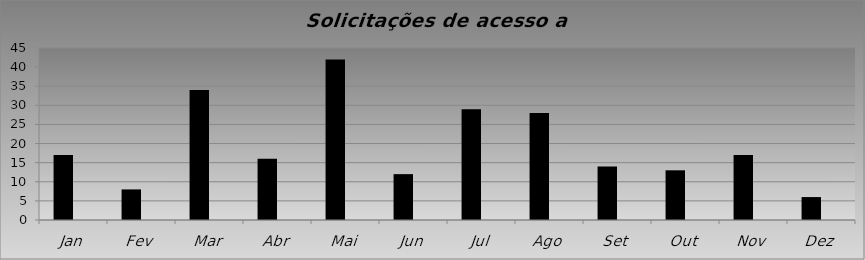
| Category | Series 0 | Series 1 |
|---|---|---|
| Jan | 17 |  |
| Fev | 8 |  |
| Mar | 34 |  |
| Abr | 16 |  |
| Mai | 42 |  |
| Jun | 12 |  |
| Jul | 29 |  |
| Ago | 28 |  |
| Set | 14 |  |
| Out | 13 |  |
| Nov | 17 |  |
| Dez | 6 |  |